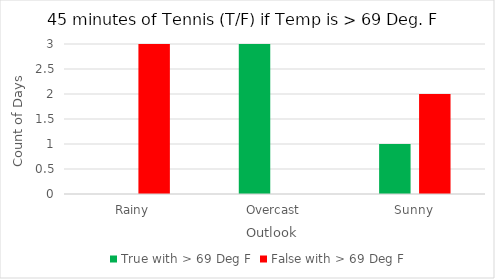
| Category | True with > 69 Deg F | False with > 69 Deg F |
|---|---|---|
| Rainy | 0 | 3 |
| Overcast | 3 | 0 |
| Sunny | 1 | 2 |